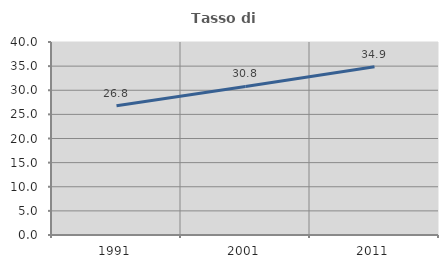
| Category | Tasso di occupazione   |
|---|---|
| 1991.0 | 26.798 |
| 2001.0 | 30.793 |
| 2011.0 | 34.875 |